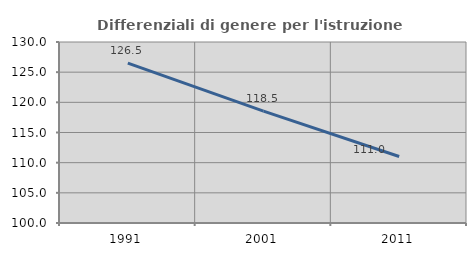
| Category | Differenziali di genere per l'istruzione superiore |
|---|---|
| 1991.0 | 126.496 |
| 2001.0 | 118.534 |
| 2011.0 | 111.016 |